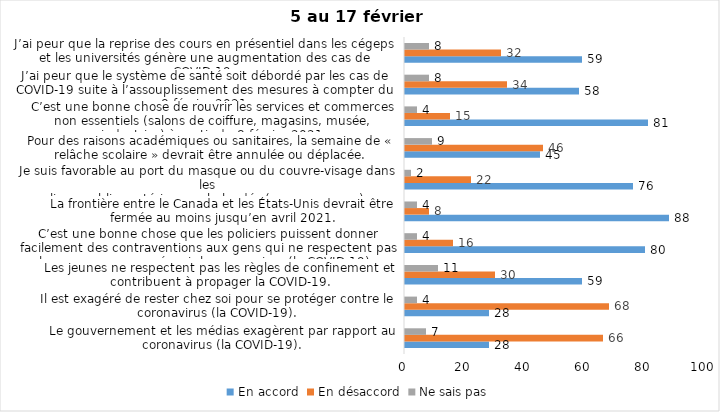
| Category | En accord | En désaccord | Ne sais pas |
|---|---|---|---|
| Le gouvernement et les médias exagèrent par rapport au coronavirus (la COVID-19). | 28 | 66 | 7 |
| Il est exagéré de rester chez soi pour se protéger contre le coronavirus (la COVID-19). | 28 | 68 | 4 |
| Les jeunes ne respectent pas les règles de confinement et contribuent à propager la COVID-19. | 59 | 30 | 11 |
| C’est une bonne chose que les policiers puissent donner facilement des contraventions aux gens qui ne respectent pas les mesures pour prévenir le coronavirus (la COVID-19). | 80 | 16 | 4 |
| La frontière entre le Canada et les États-Unis devrait être fermée au moins jusqu’en avril 2021. | 88 | 8 | 4 |
| Je suis favorable au port du masque ou du couvre-visage dans les
lieux publics extérieurs achalandés (ex. rues, parcs) | 76 | 22 | 2 |
| Pour des raisons académiques ou sanitaires, la semaine de « relâche scolaire » devrait être annulée ou déplacée. | 45 | 46 | 9 |
| C’est une bonne chose de rouvrir les services et commerces non essentiels (salons de coiffure, magasins, musée, industries) à partir du 8 février 2021. | 81 | 15 | 4 |
| J’ai peur que le système de santé soit débordé par les cas de COVID-19 suite à l’assouplissement des mesures à compter du 8 février 2021. | 58 | 34 | 8 |
| J’ai peur que la reprise des cours en présentiel dans les cégeps et les universités génère une augmentation des cas de COVID-19. | 59 | 32 | 8 |